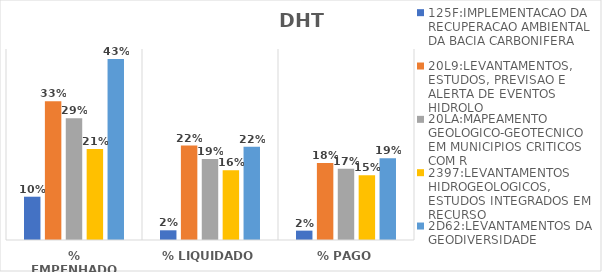
| Category | 125F:IMPLEMENTACAO DA RECUPERACAO AMBIENTAL DA BACIA CARBONIFERA | 20L9:LEVANTAMENTOS, ESTUDOS, PREVISAO E ALERTA DE EVENTOS HIDROLO | 20LA:MAPEAMENTO GEOLOGICO-GEOTECNICO EM MUNICIPIOS CRITICOS COM R | 2397:LEVANTAMENTOS HIDROGEOLOGICOS, ESTUDOS INTEGRADOS EM RECURSO | 2D62:LEVANTAMENTOS DA GEODIVERSIDADE |
|---|---|---|---|---|---|
| % EMPENHADO | 0.102 | 0.327 | 0.287 | 0.214 | 0.427 |
| % LIQUIDADO | 0.023 | 0.222 | 0.191 | 0.164 | 0.22 |
| % PAGO | 0.022 | 0.181 | 0.168 | 0.153 | 0.192 |